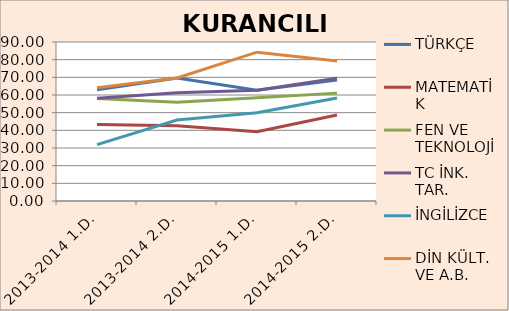
| Category | TÜRKÇE | MATEMATİK | FEN VE TEKNOLOJİ | TC İNK. TAR. | İNGİLİZCE | DİN KÜLT. VE A.B. |
|---|---|---|---|---|---|---|
| 2013-2014 1.D. | 62.93 | 43.3 | 58.08 | 58.1 | 31.9 | 64.14 |
| 2013-2014 2.D. | 69.66 | 42.59 | 55.86 | 61.21 | 45.86 | 69.66 |
| 2014-2015 1.D. | 62.73 | 39.24 | 58.48 | 62.73 | 50 | 84.24 |
| 2014-2015 2.D. | 68.48 | 48.64 | 61.06 | 69.55 | 58.33 | 79.24 |